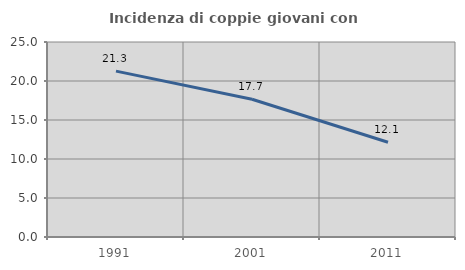
| Category | Incidenza di coppie giovani con figli |
|---|---|
| 1991.0 | 21.268 |
| 2001.0 | 17.666 |
| 2011.0 | 12.144 |